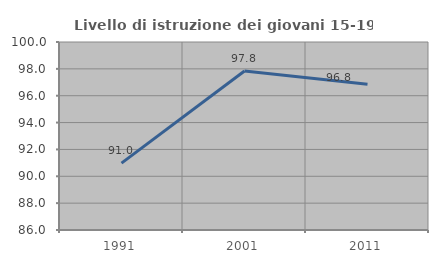
| Category | Livello di istruzione dei giovani 15-19 anni |
|---|---|
| 1991.0 | 90.984 |
| 2001.0 | 97.845 |
| 2011.0 | 96.847 |